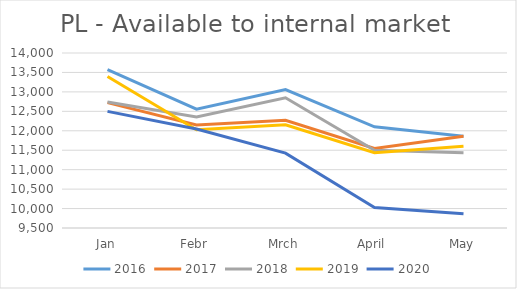
| Category | 2016 | 2017 | 2018 | 2019 | 2020 |
|---|---|---|---|---|---|
| Jan | 13574 | 12724.47 | 12738.917 | 13397.299 | 12499.487 |
| Febr | 12557 | 12151.505 | 12353.129 | 12025.119 | 12045.097 |
| Mrch | 13058 | 12270.754 | 12848.334 | 12154.313 | 11426.051 |
| April | 12101 | 11546.761 | 11498.624 | 11435.777 | 10029.338 |
| May | 11857 | 11859.97 | 11433.422 | 11603.469 | 9866.357 |